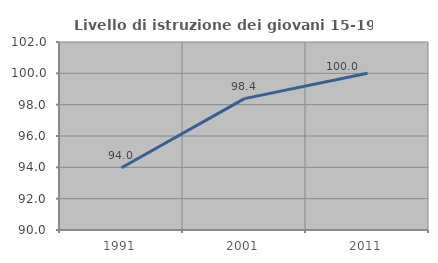
| Category | Livello di istruzione dei giovani 15-19 anni |
|---|---|
| 1991.0 | 93.976 |
| 2001.0 | 98.387 |
| 2011.0 | 100 |